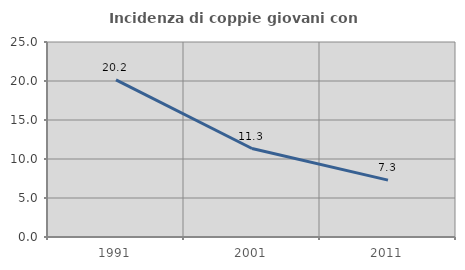
| Category | Incidenza di coppie giovani con figli |
|---|---|
| 1991.0 | 20.151 |
| 2001.0 | 11.344 |
| 2011.0 | 7.294 |